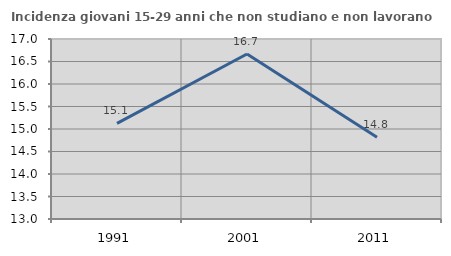
| Category | Incidenza giovani 15-29 anni che non studiano e non lavorano  |
|---|---|
| 1991.0 | 15.126 |
| 2001.0 | 16.667 |
| 2011.0 | 14.815 |